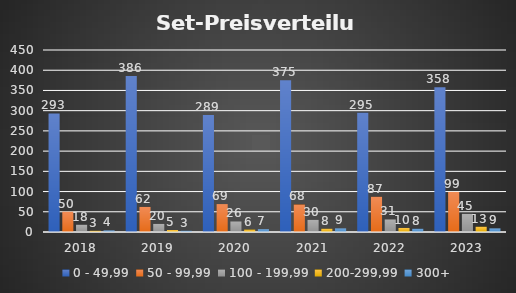
| Category | 0 - 49,99 | 50 - 99,99 | 100 - 199,99 | 200-299,99 | 300+ |
|---|---|---|---|---|---|
| 2018.0 | 293 | 50 | 18 | 3 | 4 |
| 2019.0 | 386 | 62 | 20 | 5 | 3 |
| 2020.0 | 289 | 69 | 26 | 6 | 7 |
| 2021.0 | 375 | 68 | 30 | 8 | 9 |
| 2022.0 | 295 | 87 | 31 | 10 | 8 |
| 2023.0 | 358 | 99 | 45 | 13 | 9 |